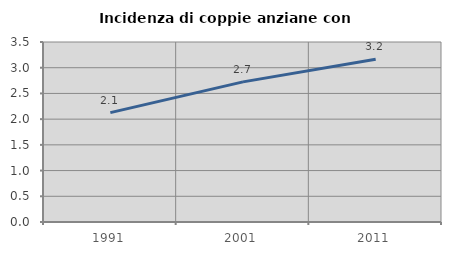
| Category | Incidenza di coppie anziane con figli |
|---|---|
| 1991.0 | 2.127 |
| 2001.0 | 2.724 |
| 2011.0 | 3.165 |